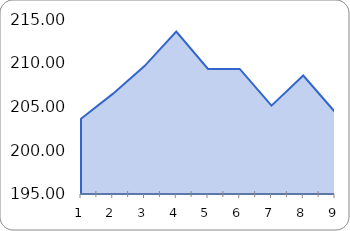
| Category | Series 0 |
|---|---|
| 0 | 203.6 |
| 1 | 206.44 |
| 2 | 209.62 |
| 3 | 213.56 |
| 4 | 209.29 |
| 5 | 209.29 |
| 6 | 205.1 |
| 7 | 208.54 |
| 8 | 204.37 |